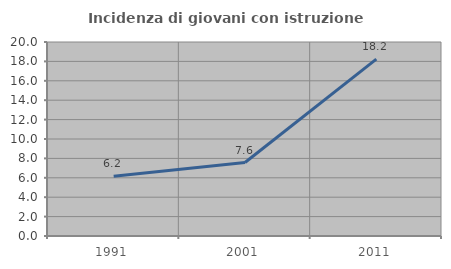
| Category | Incidenza di giovani con istruzione universitaria |
|---|---|
| 1991.0 | 6.164 |
| 2001.0 | 7.576 |
| 2011.0 | 18.229 |